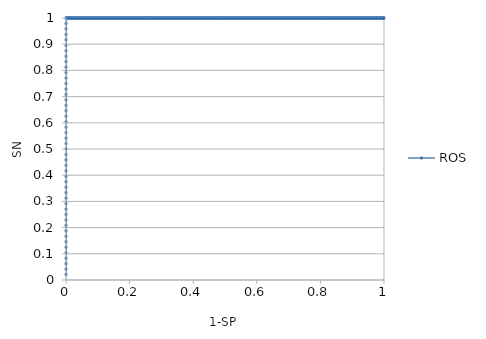
| Category | ROS |
|---|---|
| 0.0 | 0.021 |
| 0.0 | 0.042 |
| 0.0 | 0.062 |
| 0.0 | 0.083 |
| 0.0 | 0.104 |
| 0.0 | 0.125 |
| 0.0 | 0.146 |
| 0.0 | 0.167 |
| 0.0 | 0.188 |
| 0.0 | 0.208 |
| 0.0 | 0.229 |
| 0.0 | 0.25 |
| 0.0 | 0.271 |
| 0.0 | 0.292 |
| 0.0 | 0.312 |
| 0.0 | 0.333 |
| 0.0 | 0.354 |
| 0.0 | 0.375 |
| 0.0 | 0.396 |
| 0.0 | 0.417 |
| 0.0 | 0.438 |
| 0.0 | 0.458 |
| 0.0 | 0.479 |
| 0.0 | 0.5 |
| 0.0 | 0.521 |
| 0.0 | 0.542 |
| 0.0 | 0.562 |
| 0.0 | 0.583 |
| 0.0 | 0.604 |
| 0.0 | 0.625 |
| 0.0 | 0.646 |
| 0.0 | 0.667 |
| 0.0 | 0.688 |
| 0.0 | 0.708 |
| 0.0 | 0.729 |
| 0.0 | 0.75 |
| 0.0 | 0.771 |
| 0.0 | 0.792 |
| 0.0 | 0.812 |
| 0.0 | 0.833 |
| 0.0 | 0.854 |
| 0.0 | 0.875 |
| 0.0 | 0.896 |
| 0.0 | 0.917 |
| 0.0 | 0.938 |
| 0.0 | 0.958 |
| 0.0 | 0.979 |
| 0.0 | 1 |
| 0.00067476383265852 | 1 |
| 0.00134952766531715 | 1 |
| 0.00202429149797567 | 1 |
| 0.0026990553306343 | 1 |
| 0.00337381916329282 | 1 |
| 0.00404858299595146 | 1 |
| 0.00472334682860998 | 1 |
| 0.00539811066126861 | 1 |
| 0.00607287449392713 | 1 |
| 0.00674763832658565 | 1 |
| 0.00742240215924428 | 1 |
| 0.0080971659919028 | 1 |
| 0.00877192982456143 | 1 |
| 0.00944669365721995 | 1 |
| 0.0101214574898786 | 1 |
| 0.0107962213225371 | 1 |
| 0.0114709851551957 | 1 |
| 0.0121457489878543 | 1 |
| 0.0128205128205128 | 1 |
| 0.0134952766531714 | 1 |
| 0.0141700404858299 | 1 |
| 0.0148448043184886 | 1 |
| 0.0155195681511471 | 1 |
| 0.0161943319838057 | 1 |
| 0.0168690958164642 | 1 |
| 0.0175438596491229 | 1 |
| 0.0182186234817814 | 1 |
| 0.0188933873144399 | 1 |
| 0.0195681511470985 | 1 |
| 0.0202429149797571 | 1 |
| 0.0209176788124157 | 1 |
| 0.0215924426450742 | 1 |
| 0.0222672064777328 | 1 |
| 0.0229419703103914 | 1 |
| 0.0236167341430499 | 1 |
| 0.0242914979757085 | 1 |
| 0.024966261808367 | 1 |
| 0.0256410256410257 | 1 |
| 0.0263157894736842 | 1 |
| 0.0269905533063428 | 1 |
| 0.0276653171390013 | 1 |
| 0.02834008097166 | 1 |
| 0.0290148448043185 | 1 |
| 0.029689608636977 | 1 |
| 0.0303643724696356 | 1 |
| 0.0310391363022942 | 1 |
| 0.0317139001349528 | 1 |
| 0.0323886639676113 | 1 |
| 0.0330634278002699 | 1 |
| 0.0337381916329285 | 1 |
| 0.0344129554655871 | 1 |
| 0.0350877192982456 | 1 |
| 0.0357624831309041 | 1 |
| 0.0364372469635628 | 1 |
| 0.0371120107962213 | 1 |
| 0.0377867746288799 | 1 |
| 0.0384615384615384 | 1 |
| 0.0391363022941971 | 1 |
| 0.0398110661268556 | 1 |
| 0.0404858299595142 | 1 |
| 0.0411605937921727 | 1 |
| 0.0418353576248313 | 1 |
| 0.0425101214574899 | 1 |
| 0.0431848852901484 | 1 |
| 0.043859649122807 | 1 |
| 0.0445344129554656 | 1 |
| 0.0452091767881242 | 1 |
| 0.0458839406207827 | 1 |
| 0.0465587044534413 | 1 |
| 0.0472334682860999 | 1 |
| 0.0479082321187584 | 1 |
| 0.048582995951417 | 1 |
| 0.0492577597840755 | 1 |
| 0.0499325236167342 | 1 |
| 0.0506072874493927 | 1 |
| 0.0512820512820513 | 1 |
| 0.0519568151147098 | 1 |
| 0.0526315789473685 | 1 |
| 0.053306342780027 | 1 |
| 0.0539811066126855 | 1 |
| 0.0546558704453441 | 1 |
| 0.0553306342780027 | 1 |
| 0.0560053981106613 | 1 |
| 0.0566801619433198 | 1 |
| 0.0573549257759785 | 1 |
| 0.058029689608637 | 1 |
| 0.0587044534412956 | 1 |
| 0.0593792172739541 | 1 |
| 0.0600539811066126 | 1 |
| 0.0607287449392713 | 1 |
| 0.0614035087719298 | 1 |
| 0.0620782726045884 | 1 |
| 0.0627530364372469 | 1 |
| 0.0634278002699056 | 1 |
| 0.0641025641025641 | 1 |
| 0.0647773279352226 | 1 |
| 0.0654520917678812 | 1 |
| 0.0661268556005398 | 1 |
| 0.0668016194331984 | 1 |
| 0.0674763832658569 | 1 |
| 0.0681511470985156 | 1 |
| 0.0688259109311741 | 1 |
| 0.0695006747638327 | 1 |
| 0.0701754385964912 | 1 |
| 0.0708502024291497 | 1 |
| 0.0715249662618084 | 1 |
| 0.0721997300944669 | 1 |
| 0.0728744939271255 | 1 |
| 0.0735492577597841 | 1 |
| 0.0742240215924427 | 1 |
| 0.0748987854251012 | 1 |
| 0.0755735492577598 | 1 |
| 0.0762483130904184 | 1 |
| 0.0769230769230769 | 1 |
| 0.0775978407557355 | 1 |
| 0.078272604588394 | 1 |
| 0.0789473684210527 | 1 |
| 0.0796221322537112 | 1 |
| 0.0802968960863698 | 1 |
| 0.0809716599190283 | 1 |
| 0.081646423751687 | 1 |
| 0.0823211875843455 | 1 |
| 0.082995951417004 | 1 |
| 0.0836707152496626 | 1 |
| 0.0843454790823212 | 1 |
| 0.0850202429149798 | 1 |
| 0.0856950067476383 | 1 |
| 0.0863697705802969 | 1 |
| 0.0870445344129555 | 1 |
| 0.0877192982456141 | 1 |
| 0.0883940620782726 | 1 |
| 0.0890688259109311 | 1 |
| 0.0897435897435898 | 1 |
| 0.0904183535762483 | 1 |
| 0.0910931174089069 | 1 |
| 0.0917678812415654 | 1 |
| 0.0924426450742241 | 1 |
| 0.0931174089068826 | 1 |
| 0.0937921727395412 | 1 |
| 0.0944669365721997 | 1 |
| 0.0951417004048582 | 1 |
| 0.0958164642375169 | 1 |
| 0.0964912280701754 | 1 |
| 0.097165991902834 | 1 |
| 0.0978407557354926 | 1 |
| 0.0985155195681512 | 1 |
| 0.0991902834008097 | 1 |
| 0.0998650472334683 | 1 |
| 0.100539811066127 | 1 |
| 0.101214574898785 | 1 |
| 0.101889338731444 | 1 |
| 0.102564102564103 | 1 |
| 0.103238866396761 | 1 |
| 0.10391363022942 | 1 |
| 0.104588394062078 | 1 |
| 0.105263157894737 | 1 |
| 0.105937921727395 | 1 |
| 0.106612685560054 | 1 |
| 0.107287449392713 | 1 |
| 0.107962213225371 | 1 |
| 0.10863697705803 | 1 |
| 0.109311740890688 | 1 |
| 0.109986504723347 | 1 |
| 0.110661268556005 | 1 |
| 0.111336032388664 | 1 |
| 0.112010796221322 | 1 |
| 0.112685560053981 | 1 |
| 0.11336032388664 | 1 |
| 0.114035087719298 | 1 |
| 0.114709851551957 | 1 |
| 0.115384615384615 | 1 |
| 0.116059379217274 | 1 |
| 0.116734143049933 | 1 |
| 0.117408906882591 | 1 |
| 0.11808367071525 | 1 |
| 0.118758434547908 | 1 |
| 0.119433198380567 | 1 |
| 0.120107962213225 | 1 |
| 0.120782726045884 | 1 |
| 0.121457489878543 | 1 |
| 0.122132253711201 | 1 |
| 0.12280701754386 | 1 |
| 0.123481781376518 | 1 |
| 0.124156545209177 | 1 |
| 0.124831309041835 | 1 |
| 0.125506072874494 | 1 |
| 0.126180836707153 | 1 |
| 0.126855600539811 | 1 |
| 0.12753036437247 | 1 |
| 0.128205128205128 | 1 |
| 0.128879892037787 | 1 |
| 0.129554655870445 | 1 |
| 0.130229419703104 | 1 |
| 0.130904183535763 | 1 |
| 0.131578947368421 | 1 |
| 0.13225371120108 | 1 |
| 0.132928475033738 | 1 |
| 0.133603238866397 | 1 |
| 0.134278002699055 | 1 |
| 0.134952766531714 | 1 |
| 0.135627530364372 | 1 |
| 0.136302294197031 | 1 |
| 0.13697705802969 | 1 |
| 0.137651821862348 | 1 |
| 0.138326585695007 | 1 |
| 0.139001349527665 | 1 |
| 0.139676113360324 | 1 |
| 0.140350877192982 | 1 |
| 0.141025641025641 | 1 |
| 0.1417004048583 | 1 |
| 0.142375168690958 | 1 |
| 0.143049932523617 | 1 |
| 0.143724696356275 | 1 |
| 0.144399460188934 | 1 |
| 0.145074224021592 | 1 |
| 0.145748987854251 | 1 |
| 0.14642375168691 | 1 |
| 0.147098515519568 | 1 |
| 0.147773279352227 | 1 |
| 0.148448043184885 | 1 |
| 0.149122807017544 | 1 |
| 0.149797570850202 | 1 |
| 0.150472334682861 | 1 |
| 0.15114709851552 | 1 |
| 0.151821862348178 | 1 |
| 0.152496626180837 | 1 |
| 0.153171390013495 | 1 |
| 0.153846153846154 | 1 |
| 0.154520917678812 | 1 |
| 0.155195681511471 | 1 |
| 0.15587044534413 | 1 |
| 0.156545209176788 | 1 |
| 0.157219973009447 | 1 |
| 0.157894736842105 | 1 |
| 0.158569500674764 | 1 |
| 0.159244264507422 | 1 |
| 0.159919028340081 | 1 |
| 0.16059379217274 | 1 |
| 0.161268556005398 | 1 |
| 0.161943319838057 | 1 |
| 0.162618083670715 | 1 |
| 0.163292847503374 | 1 |
| 0.163967611336032 | 1 |
| 0.164642375168691 | 1 |
| 0.165317139001349 | 1 |
| 0.165991902834008 | 1 |
| 0.166666666666667 | 1 |
| 0.167341430499325 | 1 |
| 0.168016194331984 | 1 |
| 0.168690958164642 | 1 |
| 0.169365721997301 | 1 |
| 0.17004048582996 | 1 |
| 0.170715249662618 | 1 |
| 0.171390013495277 | 1 |
| 0.172064777327935 | 1 |
| 0.172739541160594 | 1 |
| 0.173414304993252 | 1 |
| 0.174089068825911 | 1 |
| 0.17476383265857 | 1 |
| 0.175438596491228 | 1 |
| 0.176113360323887 | 1 |
| 0.176788124156545 | 1 |
| 0.177462887989204 | 1 |
| 0.178137651821862 | 1 |
| 0.178812415654521 | 1 |
| 0.17948717948718 | 1 |
| 0.180161943319838 | 1 |
| 0.180836707152497 | 1 |
| 0.181511470985155 | 1 |
| 0.182186234817814 | 1 |
| 0.182860998650472 | 1 |
| 0.183535762483131 | 1 |
| 0.18421052631579 | 1 |
| 0.184885290148448 | 1 |
| 0.185560053981107 | 1 |
| 0.186234817813765 | 1 |
| 0.186909581646424 | 1 |
| 0.187584345479082 | 1 |
| 0.188259109311741 | 1 |
| 0.188933873144399 | 1 |
| 0.189608636977058 | 1 |
| 0.190283400809717 | 1 |
| 0.190958164642375 | 1 |
| 0.191632928475034 | 1 |
| 0.192307692307692 | 1 |
| 0.192982456140351 | 1 |
| 0.193657219973009 | 1 |
| 0.194331983805668 | 1 |
| 0.195006747638327 | 1 |
| 0.195681511470985 | 1 |
| 0.196356275303644 | 1 |
| 0.197031039136302 | 1 |
| 0.197705802968961 | 1 |
| 0.198380566801619 | 1 |
| 0.199055330634278 | 1 |
| 0.199730094466937 | 1 |
| 0.200404858299595 | 1 |
| 0.201079622132254 | 1 |
| 0.201754385964912 | 1 |
| 0.202429149797571 | 1 |
| 0.203103913630229 | 1 |
| 0.203778677462888 | 1 |
| 0.204453441295547 | 1 |
| 0.205128205128205 | 1 |
| 0.205802968960864 | 1 |
| 0.206477732793522 | 1 |
| 0.207152496626181 | 1 |
| 0.207827260458839 | 1 |
| 0.208502024291498 | 1 |
| 0.209176788124156 | 1 |
| 0.209851551956815 | 1 |
| 0.210526315789474 | 1 |
| 0.211201079622132 | 1 |
| 0.211875843454791 | 1 |
| 0.212550607287449 | 1 |
| 0.213225371120108 | 1 |
| 0.213900134952766 | 1 |
| 0.214574898785425 | 1 |
| 0.215249662618084 | 1 |
| 0.215924426450742 | 1 |
| 0.216599190283401 | 1 |
| 0.217273954116059 | 1 |
| 0.217948717948718 | 1 |
| 0.218623481781376 | 1 |
| 0.219298245614035 | 1 |
| 0.219973009446694 | 1 |
| 0.220647773279352 | 1 |
| 0.221322537112011 | 1 |
| 0.221997300944669 | 1 |
| 0.222672064777328 | 1 |
| 0.223346828609987 | 1 |
| 0.224021592442645 | 1 |
| 0.224696356275304 | 1 |
| 0.225371120107962 | 1 |
| 0.226045883940621 | 1 |
| 0.226720647773279 | 1 |
| 0.227395411605938 | 1 |
| 0.228070175438597 | 1 |
| 0.228744939271255 | 1 |
| 0.229419703103914 | 1 |
| 0.230094466936572 | 1 |
| 0.230769230769231 | 1 |
| 0.231443994601889 | 1 |
| 0.232118758434548 | 1 |
| 0.232793522267206 | 1 |
| 0.233468286099865 | 1 |
| 0.234143049932524 | 1 |
| 0.234817813765182 | 1 |
| 0.235492577597841 | 1 |
| 0.236167341430499 | 1 |
| 0.236842105263158 | 1 |
| 0.237516869095816 | 1 |
| 0.238191632928475 | 1 |
| 0.238866396761134 | 1 |
| 0.239541160593792 | 1 |
| 0.240215924426451 | 1 |
| 0.240890688259109 | 1 |
| 0.241565452091768 | 1 |
| 0.242240215924426 | 1 |
| 0.242914979757085 | 1 |
| 0.243589743589744 | 1 |
| 0.244264507422402 | 1 |
| 0.244939271255061 | 1 |
| 0.245614035087719 | 1 |
| 0.246288798920378 | 1 |
| 0.246963562753036 | 1 |
| 0.247638326585695 | 1 |
| 0.248313090418354 | 1 |
| 0.248987854251012 | 1 |
| 0.249662618083671 | 1 |
| 0.250337381916329 | 1 |
| 0.251012145748988 | 1 |
| 0.251686909581646 | 1 |
| 0.252361673414305 | 1 |
| 0.253036437246964 | 1 |
| 0.253711201079622 | 1 |
| 0.254385964912281 | 1 |
| 0.255060728744939 | 1 |
| 0.255735492577598 | 1 |
| 0.256410256410256 | 1 |
| 0.257085020242915 | 1 |
| 0.257759784075574 | 1 |
| 0.258434547908232 | 1 |
| 0.259109311740891 | 1 |
| 0.259784075573549 | 1 |
| 0.260458839406208 | 1 |
| 0.261133603238866 | 1 |
| 0.261808367071525 | 1 |
| 0.262483130904184 | 1 |
| 0.263157894736842 | 1 |
| 0.263832658569501 | 1 |
| 0.264507422402159 | 1 |
| 0.265182186234818 | 1 |
| 0.265856950067476 | 1 |
| 0.266531713900135 | 1 |
| 0.267206477732793 | 1 |
| 0.267881241565452 | 1 |
| 0.268556005398111 | 1 |
| 0.269230769230769 | 1 |
| 0.269905533063428 | 1 |
| 0.270580296896086 | 1 |
| 0.271255060728745 | 1 |
| 0.271929824561403 | 1 |
| 0.272604588394062 | 1 |
| 0.273279352226721 | 1 |
| 0.273954116059379 | 1 |
| 0.274628879892038 | 1 |
| 0.275303643724696 | 1 |
| 0.275978407557355 | 1 |
| 0.276653171390013 | 1 |
| 0.277327935222672 | 1 |
| 0.278002699055331 | 1 |
| 0.278677462887989 | 1 |
| 0.279352226720648 | 1 |
| 0.280026990553306 | 1 |
| 0.280701754385965 | 1 |
| 0.281376518218623 | 1 |
| 0.282051282051282 | 1 |
| 0.282726045883941 | 1 |
| 0.283400809716599 | 1 |
| 0.284075573549258 | 1 |
| 0.284750337381916 | 1 |
| 0.285425101214575 | 1 |
| 0.286099865047233 | 1 |
| 0.286774628879892 | 1 |
| 0.287449392712551 | 1 |
| 0.288124156545209 | 1 |
| 0.288798920377868 | 1 |
| 0.289473684210526 | 1 |
| 0.290148448043185 | 1 |
| 0.290823211875843 | 1 |
| 0.291497975708502 | 1 |
| 0.292172739541161 | 1 |
| 0.292847503373819 | 1 |
| 0.293522267206478 | 1 |
| 0.294197031039136 | 1 |
| 0.294871794871795 | 1 |
| 0.295546558704453 | 1 |
| 0.296221322537112 | 1 |
| 0.296896086369771 | 1 |
| 0.297570850202429 | 1 |
| 0.298245614035088 | 1 |
| 0.298920377867746 | 1 |
| 0.299595141700405 | 1 |
| 0.300269905533063 | 1 |
| 0.300944669365722 | 1 |
| 0.301619433198381 | 1 |
| 0.302294197031039 | 1 |
| 0.302968960863698 | 1 |
| 0.303643724696356 | 1 |
| 0.304318488529015 | 1 |
| 0.304993252361673 | 1 |
| 0.305668016194332 | 1 |
| 0.306342780026991 | 1 |
| 0.307017543859649 | 1 |
| 0.307692307692308 | 1 |
| 0.308367071524966 | 1 |
| 0.309041835357625 | 1 |
| 0.309716599190283 | 1 |
| 0.310391363022942 | 1 |
| 0.311066126855601 | 1 |
| 0.311740890688259 | 1 |
| 0.312415654520918 | 1 |
| 0.313090418353576 | 1 |
| 0.313765182186235 | 1 |
| 0.314439946018893 | 1 |
| 0.315114709851552 | 1 |
| 0.31578947368421 | 1 |
| 0.316464237516869 | 1 |
| 0.317139001349528 | 1 |
| 0.317813765182186 | 1 |
| 0.318488529014845 | 1 |
| 0.319163292847503 | 1 |
| 0.319838056680162 | 1 |
| 0.32051282051282 | 1 |
| 0.321187584345479 | 1 |
| 0.321862348178138 | 1 |
| 0.322537112010796 | 1 |
| 0.323211875843455 | 1 |
| 0.323886639676113 | 1 |
| 0.324561403508772 | 1 |
| 0.32523616734143 | 1 |
| 0.325910931174089 | 1 |
| 0.326585695006748 | 1 |
| 0.327260458839406 | 1 |
| 0.327935222672065 | 1 |
| 0.328609986504723 | 1 |
| 0.329284750337382 | 1 |
| 0.32995951417004 | 1 |
| 0.330634278002699 | 1 |
| 0.331309041835358 | 1 |
| 0.331983805668016 | 1 |
| 0.332658569500675 | 1 |
| 0.333333333333333 | 1 |
| 0.334008097165992 | 1 |
| 0.334682860998651 | 1 |
| 0.335357624831309 | 1 |
| 0.336032388663968 | 1 |
| 0.336707152496626 | 1 |
| 0.337381916329285 | 1 |
| 0.338056680161943 | 1 |
| 0.338731443994602 | 1 |
| 0.33940620782726 | 1 |
| 0.340080971659919 | 1 |
| 0.340755735492578 | 1 |
| 0.341430499325236 | 1 |
| 0.342105263157895 | 1 |
| 0.342780026990553 | 1 |
| 0.343454790823212 | 1 |
| 0.34412955465587 | 1 |
| 0.344804318488529 | 1 |
| 0.345479082321188 | 1 |
| 0.346153846153846 | 1 |
| 0.346828609986505 | 1 |
| 0.347503373819163 | 1 |
| 0.348178137651822 | 1 |
| 0.34885290148448 | 1 |
| 0.349527665317139 | 1 |
| 0.350202429149798 | 1 |
| 0.350877192982456 | 1 |
| 0.351551956815115 | 1 |
| 0.352226720647773 | 1 |
| 0.352901484480432 | 1 |
| 0.35357624831309 | 1 |
| 0.354251012145749 | 1 |
| 0.354925775978408 | 1 |
| 0.355600539811066 | 1 |
| 0.356275303643725 | 1 |
| 0.356950067476383 | 1 |
| 0.357624831309042 | 1 |
| 0.3582995951417 | 1 |
| 0.358974358974359 | 1 |
| 0.359649122807018 | 1 |
| 0.360323886639676 | 1 |
| 0.360998650472335 | 1 |
| 0.361673414304993 | 1 |
| 0.362348178137652 | 1 |
| 0.36302294197031 | 1 |
| 0.363697705802969 | 1 |
| 0.364372469635627 | 1 |
| 0.365047233468286 | 1 |
| 0.365721997300945 | 1 |
| 0.366396761133603 | 1 |
| 0.367071524966262 | 1 |
| 0.36774628879892 | 1 |
| 0.368421052631579 | 1 |
| 0.369095816464237 | 1 |
| 0.369770580296896 | 1 |
| 0.370445344129555 | 1 |
| 0.371120107962213 | 1 |
| 0.371794871794872 | 1 |
| 0.37246963562753 | 1 |
| 0.373144399460189 | 1 |
| 0.373819163292847 | 1 |
| 0.374493927125506 | 1 |
| 0.375168690958165 | 1 |
| 0.375843454790823 | 1 |
| 0.376518218623482 | 1 |
| 0.37719298245614 | 1 |
| 0.377867746288799 | 1 |
| 0.378542510121457 | 1 |
| 0.379217273954116 | 1 |
| 0.379892037786775 | 1 |
| 0.380566801619433 | 1 |
| 0.381241565452092 | 1 |
| 0.38191632928475 | 1 |
| 0.382591093117409 | 1 |
| 0.383265856950067 | 1 |
| 0.383940620782726 | 1 |
| 0.384615384615385 | 1 |
| 0.385290148448043 | 1 |
| 0.385964912280702 | 1 |
| 0.38663967611336 | 1 |
| 0.387314439946019 | 1 |
| 0.387989203778677 | 1 |
| 0.388663967611336 | 1 |
| 0.389338731443995 | 1 |
| 0.390013495276653 | 1 |
| 0.390688259109312 | 1 |
| 0.39136302294197 | 1 |
| 0.392037786774629 | 1 |
| 0.392712550607287 | 1 |
| 0.393387314439946 | 1 |
| 0.394062078272605 | 1 |
| 0.394736842105263 | 1 |
| 0.395411605937922 | 1 |
| 0.39608636977058 | 1 |
| 0.396761133603239 | 1 |
| 0.397435897435897 | 1 |
| 0.398110661268556 | 1 |
| 0.398785425101215 | 1 |
| 0.399460188933873 | 1 |
| 0.400134952766532 | 1 |
| 0.40080971659919 | 1 |
| 0.401484480431849 | 1 |
| 0.402159244264507 | 1 |
| 0.402834008097166 | 1 |
| 0.403508771929825 | 1 |
| 0.404183535762483 | 1 |
| 0.404858299595142 | 1 |
| 0.4055330634278 | 1 |
| 0.406207827260459 | 1 |
| 0.406882591093117 | 1 |
| 0.407557354925776 | 1 |
| 0.408232118758435 | 1 |
| 0.408906882591093 | 1 |
| 0.409581646423752 | 1 |
| 0.41025641025641 | 1 |
| 0.410931174089069 | 1 |
| 0.411605937921727 | 1 |
| 0.412280701754386 | 1 |
| 0.412955465587045 | 1 |
| 0.413630229419703 | 1 |
| 0.414304993252362 | 1 |
| 0.41497975708502 | 1 |
| 0.415654520917679 | 1 |
| 0.416329284750337 | 1 |
| 0.417004048582996 | 1 |
| 0.417678812415655 | 1 |
| 0.418353576248313 | 1 |
| 0.419028340080972 | 1 |
| 0.41970310391363 | 1 |
| 0.420377867746289 | 1 |
| 0.421052631578947 | 1 |
| 0.421727395411606 | 1 |
| 0.422402159244265 | 1 |
| 0.423076923076923 | 1 |
| 0.423751686909582 | 1 |
| 0.42442645074224 | 1 |
| 0.425101214574899 | 1 |
| 0.425775978407557 | 1 |
| 0.426450742240216 | 1 |
| 0.427125506072875 | 1 |
| 0.427800269905533 | 1 |
| 0.428475033738192 | 1 |
| 0.42914979757085 | 1 |
| 0.429824561403509 | 1 |
| 0.430499325236167 | 1 |
| 0.431174089068826 | 1 |
| 0.431848852901484 | 1 |
| 0.432523616734143 | 1 |
| 0.433198380566802 | 1 |
| 0.43387314439946 | 1 |
| 0.434547908232119 | 1 |
| 0.435222672064777 | 1 |
| 0.435897435897436 | 1 |
| 0.436572199730094 | 1 |
| 0.437246963562753 | 1 |
| 0.437921727395412 | 1 |
| 0.43859649122807 | 1 |
| 0.439271255060729 | 1 |
| 0.439946018893387 | 1 |
| 0.440620782726046 | 1 |
| 0.441295546558704 | 1 |
| 0.441970310391363 | 1 |
| 0.442645074224022 | 1 |
| 0.44331983805668 | 1 |
| 0.443994601889339 | 1 |
| 0.444669365721997 | 1 |
| 0.445344129554656 | 1 |
| 0.446018893387314 | 1 |
| 0.446693657219973 | 1 |
| 0.447368421052632 | 1 |
| 0.44804318488529 | 1 |
| 0.448717948717949 | 1 |
| 0.449392712550607 | 1 |
| 0.450067476383266 | 1 |
| 0.450742240215924 | 1 |
| 0.451417004048583 | 1 |
| 0.452091767881242 | 1 |
| 0.4527665317139 | 1 |
| 0.453441295546559 | 1 |
| 0.454116059379217 | 1 |
| 0.454790823211876 | 1 |
| 0.455465587044534 | 1 |
| 0.456140350877193 | 1 |
| 0.456815114709852 | 1 |
| 0.45748987854251 | 1 |
| 0.458164642375169 | 1 |
| 0.458839406207827 | 1 |
| 0.459514170040486 | 1 |
| 0.460188933873144 | 1 |
| 0.460863697705803 | 1 |
| 0.461538461538462 | 1 |
| 0.46221322537112 | 1 |
| 0.462887989203779 | 1 |
| 0.463562753036437 | 1 |
| 0.464237516869096 | 1 |
| 0.464912280701754 | 1 |
| 0.465587044534413 | 1 |
| 0.466261808367072 | 1 |
| 0.46693657219973 | 1 |
| 0.467611336032389 | 1 |
| 0.468286099865047 | 1 |
| 0.468960863697706 | 1 |
| 0.469635627530364 | 1 |
| 0.470310391363023 | 1 |
| 0.470985155195682 | 1 |
| 0.47165991902834 | 1 |
| 0.472334682860999 | 1 |
| 0.473009446693657 | 1 |
| 0.473684210526316 | 1 |
| 0.474358974358974 | 1 |
| 0.475033738191633 | 1 |
| 0.475708502024292 | 1 |
| 0.47638326585695 | 1 |
| 0.477058029689609 | 1 |
| 0.477732793522267 | 1 |
| 0.478407557354926 | 1 |
| 0.479082321187584 | 1 |
| 0.479757085020243 | 1 |
| 0.480431848852901 | 1 |
| 0.48110661268556 | 1 |
| 0.481781376518219 | 1 |
| 0.482456140350877 | 1 |
| 0.483130904183536 | 1 |
| 0.483805668016194 | 1 |
| 0.484480431848853 | 1 |
| 0.485155195681511 | 1 |
| 0.48582995951417 | 1 |
| 0.486504723346829 | 1 |
| 0.487179487179487 | 1 |
| 0.487854251012146 | 1 |
| 0.488529014844804 | 1 |
| 0.489203778677463 | 1 |
| 0.489878542510121 | 1 |
| 0.49055330634278 | 1 |
| 0.491228070175439 | 1 |
| 0.491902834008097 | 1 |
| 0.492577597840756 | 1 |
| 0.493252361673414 | 1 |
| 0.493927125506073 | 1 |
| 0.494601889338731 | 1 |
| 0.49527665317139 | 1 |
| 0.495951417004049 | 1 |
| 0.496626180836707 | 1 |
| 0.497300944669366 | 1 |
| 0.497975708502024 | 1 |
| 0.498650472334683 | 1 |
| 0.499325236167342 | 1 |
| 0.5 | 1 |
| 0.500674763832659 | 1 |
| 0.501349527665317 | 1 |
| 0.502024291497976 | 1 |
| 0.502699055330634 | 1 |
| 0.503373819163293 | 1 |
| 0.504048582995951 | 1 |
| 0.50472334682861 | 1 |
| 0.505398110661269 | 1 |
| 0.506072874493927 | 1 |
| 0.506747638326586 | 1 |
| 0.507422402159244 | 1 |
| 0.508097165991903 | 1 |
| 0.508771929824561 | 1 |
| 0.50944669365722 | 1 |
| 0.510121457489878 | 1 |
| 0.510796221322537 | 1 |
| 0.511470985155196 | 1 |
| 0.512145748987854 | 1 |
| 0.512820512820513 | 1 |
| 0.513495276653171 | 1 |
| 0.51417004048583 | 1 |
| 0.514844804318489 | 1 |
| 0.515519568151147 | 1 |
| 0.516194331983806 | 1 |
| 0.516869095816464 | 1 |
| 0.517543859649123 | 1 |
| 0.518218623481781 | 1 |
| 0.51889338731444 | 1 |
| 0.519568151147099 | 1 |
| 0.520242914979757 | 1 |
| 0.520917678812416 | 1 |
| 0.521592442645074 | 1 |
| 0.522267206477733 | 1 |
| 0.522941970310391 | 1 |
| 0.52361673414305 | 1 |
| 0.524291497975709 | 1 |
| 0.524966261808367 | 1 |
| 0.525641025641026 | 1 |
| 0.526315789473684 | 1 |
| 0.526990553306343 | 1 |
| 0.527665317139001 | 1 |
| 0.52834008097166 | 1 |
| 0.529014844804318 | 1 |
| 0.529689608636977 | 1 |
| 0.530364372469636 | 1 |
| 0.531039136302294 | 1 |
| 0.531713900134953 | 1 |
| 0.532388663967611 | 1 |
| 0.53306342780027 | 1 |
| 0.533738191632928 | 1 |
| 0.534412955465587 | 1 |
| 0.535087719298246 | 1 |
| 0.535762483130904 | 1 |
| 0.536437246963563 | 1 |
| 0.537112010796221 | 1 |
| 0.53778677462888 | 1 |
| 0.538461538461538 | 1 |
| 0.539136302294197 | 1 |
| 0.539811066126856 | 1 |
| 0.540485829959514 | 1 |
| 0.541160593792173 | 1 |
| 0.541835357624831 | 1 |
| 0.54251012145749 | 1 |
| 0.543184885290148 | 1 |
| 0.543859649122807 | 1 |
| 0.544534412955466 | 1 |
| 0.545209176788124 | 1 |
| 0.545883940620783 | 1 |
| 0.546558704453441 | 1 |
| 0.5472334682861 | 1 |
| 0.547908232118759 | 1 |
| 0.548582995951417 | 1 |
| 0.549257759784076 | 1 |
| 0.549932523616734 | 1 |
| 0.550607287449393 | 1 |
| 0.551282051282051 | 1 |
| 0.55195681511471 | 1 |
| 0.552631578947368 | 1 |
| 0.553306342780027 | 1 |
| 0.553981106612686 | 1 |
| 0.554655870445344 | 1 |
| 0.555330634278003 | 1 |
| 0.556005398110661 | 1 |
| 0.55668016194332 | 1 |
| 0.557354925775978 | 1 |
| 0.558029689608637 | 1 |
| 0.558704453441295 | 1 |
| 0.559379217273954 | 1 |
| 0.560053981106613 | 1 |
| 0.560728744939271 | 1 |
| 0.56140350877193 | 1 |
| 0.562078272604588 | 1 |
| 0.562753036437247 | 1 |
| 0.563427800269906 | 1 |
| 0.564102564102564 | 1 |
| 0.564777327935223 | 1 |
| 0.565452091767881 | 1 |
| 0.56612685560054 | 1 |
| 0.566801619433198 | 1 |
| 0.567476383265857 | 1 |
| 0.568151147098515 | 1 |
| 0.568825910931174 | 1 |
| 0.569500674763833 | 1 |
| 0.570175438596491 | 1 |
| 0.57085020242915 | 1 |
| 0.571524966261808 | 1 |
| 0.572199730094467 | 1 |
| 0.572874493927126 | 1 |
| 0.573549257759784 | 1 |
| 0.574224021592443 | 1 |
| 0.574898785425101 | 1 |
| 0.57557354925776 | 1 |
| 0.576248313090418 | 1 |
| 0.576923076923077 | 1 |
| 0.577597840755735 | 1 |
| 0.578272604588394 | 1 |
| 0.578947368421053 | 1 |
| 0.579622132253711 | 1 |
| 0.58029689608637 | 1 |
| 0.580971659919028 | 1 |
| 0.581646423751687 | 1 |
| 0.582321187584345 | 1 |
| 0.582995951417004 | 1 |
| 0.583670715249663 | 1 |
| 0.584345479082321 | 1 |
| 0.58502024291498 | 1 |
| 0.585695006747638 | 1 |
| 0.586369770580297 | 1 |
| 0.587044534412955 | 1 |
| 0.587719298245614 | 1 |
| 0.588394062078273 | 1 |
| 0.589068825910931 | 1 |
| 0.58974358974359 | 1 |
| 0.590418353576248 | 1 |
| 0.591093117408907 | 1 |
| 0.591767881241565 | 1 |
| 0.592442645074224 | 1 |
| 0.593117408906883 | 1 |
| 0.593792172739541 | 1 |
| 0.5944669365722 | 1 |
| 0.595141700404858 | 1 |
| 0.595816464237517 | 1 |
| 0.596491228070176 | 1 |
| 0.597165991902834 | 1 |
| 0.597840755735493 | 1 |
| 0.598515519568151 | 1 |
| 0.59919028340081 | 1 |
| 0.599865047233468 | 1 |
| 0.600539811066127 | 1 |
| 0.601214574898785 | 1 |
| 0.601889338731444 | 1 |
| 0.602564102564103 | 1 |
| 0.603238866396761 | 1 |
| 0.60391363022942 | 1 |
| 0.604588394062078 | 1 |
| 0.605263157894737 | 1 |
| 0.605937921727395 | 1 |
| 0.606612685560054 | 1 |
| 0.607287449392712 | 1 |
| 0.607962213225371 | 1 |
| 0.60863697705803 | 1 |
| 0.609311740890688 | 1 |
| 0.609986504723347 | 1 |
| 0.610661268556005 | 1 |
| 0.611336032388664 | 1 |
| 0.612010796221323 | 1 |
| 0.612685560053981 | 1 |
| 0.61336032388664 | 1 |
| 0.614035087719298 | 1 |
| 0.614709851551957 | 1 |
| 0.615384615384615 | 1 |
| 0.616059379217274 | 1 |
| 0.616734143049932 | 1 |
| 0.617408906882591 | 1 |
| 0.61808367071525 | 1 |
| 0.618758434547908 | 1 |
| 0.619433198380567 | 1 |
| 0.620107962213225 | 1 |
| 0.620782726045884 | 1 |
| 0.621457489878543 | 1 |
| 0.622132253711201 | 1 |
| 0.62280701754386 | 1 |
| 0.623481781376518 | 1 |
| 0.624156545209177 | 1 |
| 0.624831309041835 | 1 |
| 0.625506072874494 | 1 |
| 0.626180836707152 | 1 |
| 0.626855600539811 | 1 |
| 0.62753036437247 | 1 |
| 0.628205128205128 | 1 |
| 0.628879892037787 | 1 |
| 0.629554655870445 | 1 |
| 0.630229419703104 | 1 |
| 0.630904183535762 | 1 |
| 0.631578947368421 | 1 |
| 0.63225371120108 | 1 |
| 0.632928475033738 | 1 |
| 0.633603238866397 | 1 |
| 0.634278002699055 | 1 |
| 0.634952766531714 | 1 |
| 0.635627530364372 | 1 |
| 0.636302294197031 | 1 |
| 0.63697705802969 | 1 |
| 0.637651821862348 | 1 |
| 0.638326585695007 | 1 |
| 0.639001349527665 | 1 |
| 0.639676113360324 | 1 |
| 0.640350877192982 | 1 |
| 0.641025641025641 | 1 |
| 0.6417004048583 | 1 |
| 0.642375168690958 | 1 |
| 0.643049932523617 | 1 |
| 0.643724696356275 | 1 |
| 0.644399460188934 | 1 |
| 0.645074224021592 | 1 |
| 0.645748987854251 | 1 |
| 0.64642375168691 | 1 |
| 0.647098515519568 | 1 |
| 0.647773279352227 | 1 |
| 0.648448043184885 | 1 |
| 0.649122807017544 | 1 |
| 0.649797570850202 | 1 |
| 0.650472334682861 | 1 |
| 0.65114709851552 | 1 |
| 0.651821862348178 | 1 |
| 0.652496626180837 | 1 |
| 0.653171390013495 | 1 |
| 0.653846153846154 | 1 |
| 0.654520917678812 | 1 |
| 0.655195681511471 | 1 |
| 0.65587044534413 | 1 |
| 0.656545209176788 | 1 |
| 0.657219973009447 | 1 |
| 0.657894736842105 | 1 |
| 0.658569500674764 | 1 |
| 0.659244264507422 | 1 |
| 0.659919028340081 | 1 |
| 0.66059379217274 | 1 |
| 0.661268556005398 | 1 |
| 0.661943319838057 | 1 |
| 0.662618083670715 | 1 |
| 0.663292847503374 | 1 |
| 0.663967611336032 | 1 |
| 0.664642375168691 | 1 |
| 0.66531713900135 | 1 |
| 0.665991902834008 | 1 |
| 0.666666666666667 | 1 |
| 0.667341430499325 | 1 |
| 0.668016194331984 | 1 |
| 0.668690958164642 | 1 |
| 0.669365721997301 | 1 |
| 0.67004048582996 | 1 |
| 0.670715249662618 | 1 |
| 0.671390013495277 | 1 |
| 0.672064777327935 | 1 |
| 0.672739541160594 | 1 |
| 0.673414304993252 | 1 |
| 0.674089068825911 | 1 |
| 0.674763832658569 | 1 |
| 0.675438596491228 | 1 |
| 0.676113360323887 | 1 |
| 0.676788124156545 | 1 |
| 0.677462887989204 | 1 |
| 0.678137651821862 | 1 |
| 0.678812415654521 | 1 |
| 0.67948717948718 | 1 |
| 0.680161943319838 | 1 |
| 0.680836707152497 | 1 |
| 0.681511470985155 | 1 |
| 0.682186234817814 | 1 |
| 0.682860998650472 | 1 |
| 0.683535762483131 | 1 |
| 0.68421052631579 | 1 |
| 0.684885290148448 | 1 |
| 0.685560053981107 | 1 |
| 0.686234817813765 | 1 |
| 0.686909581646424 | 1 |
| 0.687584345479082 | 1 |
| 0.688259109311741 | 1 |
| 0.688933873144399 | 1 |
| 0.689608636977058 | 1 |
| 0.690283400809717 | 1 |
| 0.690958164642375 | 1 |
| 0.691632928475034 | 1 |
| 0.692307692307692 | 1 |
| 0.692982456140351 | 1 |
| 0.693657219973009 | 1 |
| 0.694331983805668 | 1 |
| 0.695006747638327 | 1 |
| 0.695681511470985 | 1 |
| 0.696356275303644 | 1 |
| 0.697031039136302 | 1 |
| 0.697705802968961 | 1 |
| 0.698380566801619 | 1 |
| 0.699055330634278 | 1 |
| 0.699730094466937 | 1 |
| 0.700404858299595 | 1 |
| 0.701079622132254 | 1 |
| 0.701754385964912 | 1 |
| 0.702429149797571 | 1 |
| 0.703103913630229 | 1 |
| 0.703778677462888 | 1 |
| 0.704453441295547 | 1 |
| 0.705128205128205 | 1 |
| 0.705802968960864 | 1 |
| 0.706477732793522 | 1 |
| 0.707152496626181 | 1 |
| 0.707827260458839 | 1 |
| 0.708502024291498 | 1 |
| 0.709176788124157 | 1 |
| 0.709851551956815 | 1 |
| 0.710526315789474 | 1 |
| 0.711201079622132 | 1 |
| 0.711875843454791 | 1 |
| 0.712550607287449 | 1 |
| 0.713225371120108 | 1 |
| 0.713900134952767 | 1 |
| 0.714574898785425 | 1 |
| 0.715249662618084 | 1 |
| 0.715924426450742 | 1 |
| 0.716599190283401 | 1 |
| 0.717273954116059 | 1 |
| 0.717948717948718 | 1 |
| 0.718623481781377 | 1 |
| 0.719298245614035 | 1 |
| 0.719973009446694 | 1 |
| 0.720647773279352 | 1 |
| 0.721322537112011 | 1 |
| 0.721997300944669 | 1 |
| 0.722672064777328 | 1 |
| 0.723346828609986 | 1 |
| 0.724021592442645 | 1 |
| 0.724696356275304 | 1 |
| 0.725371120107962 | 1 |
| 0.726045883940621 | 1 |
| 0.726720647773279 | 1 |
| 0.727395411605938 | 1 |
| 0.728070175438597 | 1 |
| 0.728744939271255 | 1 |
| 0.729419703103914 | 1 |
| 0.730094466936572 | 1 |
| 0.730769230769231 | 1 |
| 0.731443994601889 | 1 |
| 0.732118758434548 | 1 |
| 0.732793522267206 | 1 |
| 0.733468286099865 | 1 |
| 0.734143049932524 | 1 |
| 0.734817813765182 | 1 |
| 0.735492577597841 | 1 |
| 0.736167341430499 | 1 |
| 0.736842105263158 | 1 |
| 0.737516869095817 | 1 |
| 0.738191632928475 | 1 |
| 0.738866396761134 | 1 |
| 0.739541160593792 | 1 |
| 0.740215924426451 | 1 |
| 0.740890688259109 | 1 |
| 0.741565452091768 | 1 |
| 0.742240215924426 | 1 |
| 0.742914979757085 | 1 |
| 0.743589743589744 | 1 |
| 0.744264507422402 | 1 |
| 0.744939271255061 | 1 |
| 0.745614035087719 | 1 |
| 0.746288798920378 | 1 |
| 0.746963562753036 | 1 |
| 0.747638326585695 | 1 |
| 0.748313090418354 | 1 |
| 0.748987854251012 | 1 |
| 0.749662618083671 | 1 |
| 0.750337381916329 | 1 |
| 0.751012145748988 | 1 |
| 0.751686909581646 | 1 |
| 0.752361673414305 | 1 |
| 0.753036437246964 | 1 |
| 0.753711201079622 | 1 |
| 0.754385964912281 | 1 |
| 0.755060728744939 | 1 |
| 0.755735492577598 | 1 |
| 0.756410256410256 | 1 |
| 0.757085020242915 | 1 |
| 0.757759784075574 | 1 |
| 0.758434547908232 | 1 |
| 0.759109311740891 | 1 |
| 0.759784075573549 | 1 |
| 0.760458839406208 | 1 |
| 0.761133603238866 | 1 |
| 0.761808367071525 | 1 |
| 0.762483130904184 | 1 |
| 0.763157894736842 | 1 |
| 0.763832658569501 | 1 |
| 0.764507422402159 | 1 |
| 0.765182186234818 | 1 |
| 0.765856950067476 | 1 |
| 0.766531713900135 | 1 |
| 0.767206477732793 | 1 |
| 0.767881241565452 | 1 |
| 0.768556005398111 | 1 |
| 0.769230769230769 | 1 |
| 0.769905533063428 | 1 |
| 0.770580296896086 | 1 |
| 0.771255060728745 | 1 |
| 0.771929824561403 | 1 |
| 0.772604588394062 | 1 |
| 0.773279352226721 | 1 |
| 0.773954116059379 | 1 |
| 0.774628879892038 | 1 |
| 0.775303643724696 | 1 |
| 0.775978407557355 | 1 |
| 0.776653171390014 | 1 |
| 0.777327935222672 | 1 |
| 0.778002699055331 | 1 |
| 0.778677462887989 | 1 |
| 0.779352226720648 | 1 |
| 0.780026990553306 | 1 |
| 0.780701754385965 | 1 |
| 0.781376518218623 | 1 |
| 0.782051282051282 | 1 |
| 0.782726045883941 | 1 |
| 0.783400809716599 | 1 |
| 0.784075573549258 | 1 |
| 0.784750337381916 | 1 |
| 0.785425101214575 | 1 |
| 0.786099865047234 | 1 |
| 0.786774628879892 | 1 |
| 0.787449392712551 | 1 |
| 0.788124156545209 | 1 |
| 0.788798920377868 | 1 |
| 0.789473684210526 | 1 |
| 0.790148448043185 | 1 |
| 0.790823211875843 | 1 |
| 0.791497975708502 | 1 |
| 0.792172739541161 | 1 |
| 0.792847503373819 | 1 |
| 0.793522267206478 | 1 |
| 0.794197031039136 | 1 |
| 0.794871794871795 | 1 |
| 0.795546558704453 | 1 |
| 0.796221322537112 | 1 |
| 0.796896086369771 | 1 |
| 0.797570850202429 | 1 |
| 0.798245614035088 | 1 |
| 0.798920377867746 | 1 |
| 0.799595141700405 | 1 |
| 0.800269905533063 | 1 |
| 0.800944669365722 | 1 |
| 0.80161943319838 | 1 |
| 0.802294197031039 | 1 |
| 0.802968960863698 | 1 |
| 0.803643724696356 | 1 |
| 0.804318488529015 | 1 |
| 0.804993252361673 | 1 |
| 0.805668016194332 | 1 |
| 0.80634278002699 | 1 |
| 0.807017543859649 | 1 |
| 0.807692307692308 | 1 |
| 0.808367071524966 | 1 |
| 0.809041835357625 | 1 |
| 0.809716599190283 | 1 |
| 0.810391363022942 | 1 |
| 0.8110661268556 | 1 |
| 0.811740890688259 | 1 |
| 0.812415654520918 | 1 |
| 0.813090418353576 | 1 |
| 0.813765182186235 | 1 |
| 0.814439946018893 | 1 |
| 0.815114709851552 | 1 |
| 0.81578947368421 | 1 |
| 0.816464237516869 | 1 |
| 0.817139001349528 | 1 |
| 0.817813765182186 | 1 |
| 0.818488529014845 | 1 |
| 0.819163292847503 | 1 |
| 0.819838056680162 | 1 |
| 0.82051282051282 | 1 |
| 0.821187584345479 | 1 |
| 0.821862348178138 | 1 |
| 0.822537112010796 | 1 |
| 0.823211875843455 | 1 |
| 0.823886639676113 | 1 |
| 0.824561403508772 | 1 |
| 0.82523616734143 | 1 |
| 0.825910931174089 | 1 |
| 0.826585695006748 | 1 |
| 0.827260458839406 | 1 |
| 0.827935222672065 | 1 |
| 0.828609986504723 | 1 |
| 0.829284750337382 | 1 |
| 0.82995951417004 | 1 |
| 0.830634278002699 | 1 |
| 0.831309041835358 | 1 |
| 0.831983805668016 | 1 |
| 0.832658569500675 | 1 |
| 0.833333333333333 | 1 |
| 0.834008097165992 | 1 |
| 0.83468286099865 | 1 |
| 0.835357624831309 | 1 |
| 0.836032388663968 | 1 |
| 0.836707152496626 | 1 |
| 0.837381916329285 | 1 |
| 0.838056680161943 | 1 |
| 0.838731443994602 | 1 |
| 0.83940620782726 | 1 |
| 0.840080971659919 | 1 |
| 0.840755735492578 | 1 |
| 0.841430499325236 | 1 |
| 0.842105263157895 | 1 |
| 0.842780026990553 | 1 |
| 0.843454790823212 | 1 |
| 0.84412955465587 | 1 |
| 0.844804318488529 | 1 |
| 0.845479082321188 | 1 |
| 0.846153846153846 | 1 |
| 0.846828609986505 | 1 |
| 0.847503373819163 | 1 |
| 0.848178137651822 | 1 |
| 0.84885290148448 | 1 |
| 0.849527665317139 | 1 |
| 0.850202429149798 | 1 |
| 0.850877192982456 | 1 |
| 0.851551956815115 | 1 |
| 0.852226720647773 | 1 |
| 0.852901484480432 | 1 |
| 0.85357624831309 | 1 |
| 0.854251012145749 | 1 |
| 0.854925775978407 | 1 |
| 0.855600539811066 | 1 |
| 0.856275303643725 | 1 |
| 0.856950067476383 | 1 |
| 0.857624831309042 | 1 |
| 0.8582995951417 | 1 |
| 0.858974358974359 | 1 |
| 0.859649122807017 | 1 |
| 0.860323886639676 | 1 |
| 0.860998650472335 | 1 |
| 0.861673414304993 | 1 |
| 0.862348178137652 | 1 |
| 0.86302294197031 | 1 |
| 0.863697705802969 | 1 |
| 0.864372469635627 | 1 |
| 0.865047233468286 | 1 |
| 0.865721997300945 | 1 |
| 0.866396761133603 | 1 |
| 0.867071524966262 | 1 |
| 0.86774628879892 | 1 |
| 0.868421052631579 | 1 |
| 0.869095816464237 | 1 |
| 0.869770580296896 | 1 |
| 0.870445344129555 | 1 |
| 0.871120107962213 | 1 |
| 0.871794871794872 | 1 |
| 0.87246963562753 | 1 |
| 0.873144399460189 | 1 |
| 0.873819163292847 | 1 |
| 0.874493927125506 | 1 |
| 0.875168690958165 | 1 |
| 0.875843454790823 | 1 |
| 0.876518218623482 | 1 |
| 0.87719298245614 | 1 |
| 0.877867746288799 | 1 |
| 0.878542510121457 | 1 |
| 0.879217273954116 | 1 |
| 0.879892037786775 | 1 |
| 0.880566801619433 | 1 |
| 0.881241565452092 | 1 |
| 0.88191632928475 | 1 |
| 0.882591093117409 | 1 |
| 0.883265856950067 | 1 |
| 0.883940620782726 | 1 |
| 0.884615384615385 | 1 |
| 0.885290148448043 | 1 |
| 0.885964912280702 | 1 |
| 0.88663967611336 | 1 |
| 0.887314439946019 | 1 |
| 0.887989203778677 | 1 |
| 0.888663967611336 | 1 |
| 0.889338731443995 | 1 |
| 0.890013495276653 | 1 |
| 0.890688259109312 | 1 |
| 0.89136302294197 | 1 |
| 0.892037786774629 | 1 |
| 0.892712550607287 | 1 |
| 0.893387314439946 | 1 |
| 0.894062078272605 | 1 |
| 0.894736842105263 | 1 |
| 0.895411605937922 | 1 |
| 0.89608636977058 | 1 |
| 0.896761133603239 | 1 |
| 0.897435897435897 | 1 |
| 0.898110661268556 | 1 |
| 0.898785425101215 | 1 |
| 0.899460188933873 | 1 |
| 0.900134952766532 | 1 |
| 0.90080971659919 | 1 |
| 0.901484480431849 | 1 |
| 0.902159244264507 | 1 |
| 0.902834008097166 | 1 |
| 0.903508771929825 | 1 |
| 0.904183535762483 | 1 |
| 0.904858299595142 | 1 |
| 0.9055330634278 | 1 |
| 0.906207827260459 | 1 |
| 0.906882591093117 | 1 |
| 0.907557354925776 | 1 |
| 0.908232118758435 | 1 |
| 0.908906882591093 | 1 |
| 0.909581646423752 | 1 |
| 0.91025641025641 | 1 |
| 0.910931174089069 | 1 |
| 0.911605937921727 | 1 |
| 0.912280701754386 | 1 |
| 0.912955465587045 | 1 |
| 0.913630229419703 | 1 |
| 0.914304993252362 | 1 |
| 0.91497975708502 | 1 |
| 0.915654520917679 | 1 |
| 0.916329284750337 | 1 |
| 0.917004048582996 | 1 |
| 0.917678812415655 | 1 |
| 0.918353576248313 | 1 |
| 0.919028340080972 | 1 |
| 0.91970310391363 | 1 |
| 0.920377867746289 | 1 |
| 0.921052631578947 | 1 |
| 0.921727395411606 | 1 |
| 0.922402159244265 | 1 |
| 0.923076923076923 | 1 |
| 0.923751686909582 | 1 |
| 0.92442645074224 | 1 |
| 0.925101214574899 | 1 |
| 0.925775978407557 | 1 |
| 0.926450742240216 | 1 |
| 0.927125506072875 | 1 |
| 0.927800269905533 | 1 |
| 0.928475033738192 | 1 |
| 0.92914979757085 | 1 |
| 0.929824561403509 | 1 |
| 0.930499325236167 | 1 |
| 0.931174089068826 | 1 |
| 0.931848852901485 | 1 |
| 0.932523616734143 | 1 |
| 0.933198380566802 | 1 |
| 0.93387314439946 | 1 |
| 0.934547908232119 | 1 |
| 0.935222672064777 | 1 |
| 0.935897435897436 | 1 |
| 0.936572199730094 | 1 |
| 0.937246963562753 | 1 |
| 0.937921727395412 | 1 |
| 0.93859649122807 | 1 |
| 0.939271255060729 | 1 |
| 0.939946018893387 | 1 |
| 0.940620782726046 | 1 |
| 0.941295546558704 | 1 |
| 0.941970310391363 | 1 |
| 0.942645074224022 | 1 |
| 0.94331983805668 | 1 |
| 0.943994601889339 | 1 |
| 0.944669365721997 | 1 |
| 0.945344129554656 | 1 |
| 0.946018893387314 | 1 |
| 0.946693657219973 | 1 |
| 0.947368421052632 | 1 |
| 0.94804318488529 | 1 |
| 0.948717948717949 | 1 |
| 0.949392712550607 | 1 |
| 0.950067476383266 | 1 |
| 0.950742240215924 | 1 |
| 0.951417004048583 | 1 |
| 0.952091767881242 | 1 |
| 0.9527665317139 | 1 |
| 0.953441295546559 | 1 |
| 0.954116059379217 | 1 |
| 0.954790823211876 | 1 |
| 0.955465587044534 | 1 |
| 0.956140350877193 | 1 |
| 0.956815114709852 | 1 |
| 0.95748987854251 | 1 |
| 0.958164642375169 | 1 |
| 0.958839406207827 | 1 |
| 0.959514170040486 | 1 |
| 0.960188933873144 | 1 |
| 0.960863697705803 | 1 |
| 0.961538461538462 | 1 |
| 0.96221322537112 | 1 |
| 0.962887989203779 | 1 |
| 0.963562753036437 | 1 |
| 0.964237516869096 | 1 |
| 0.964912280701754 | 1 |
| 0.965587044534413 | 1 |
| 0.966261808367072 | 1 |
| 0.96693657219973 | 1 |
| 0.967611336032389 | 1 |
| 0.968286099865047 | 1 |
| 0.968960863697706 | 1 |
| 0.969635627530364 | 1 |
| 0.970310391363023 | 1 |
| 0.970985155195682 | 1 |
| 0.97165991902834 | 1 |
| 0.972334682860999 | 1 |
| 0.973009446693657 | 1 |
| 0.973684210526316 | 1 |
| 0.974358974358974 | 1 |
| 0.975033738191633 | 1 |
| 0.975708502024292 | 1 |
| 0.97638326585695 | 1 |
| 0.977058029689609 | 1 |
| 0.977732793522267 | 1 |
| 0.978407557354926 | 1 |
| 0.979082321187584 | 1 |
| 0.979757085020243 | 1 |
| 0.980431848852902 | 1 |
| 0.98110661268556 | 1 |
| 0.981781376518219 | 1 |
| 0.982456140350877 | 1 |
| 0.983130904183536 | 1 |
| 0.983805668016194 | 1 |
| 0.984480431848853 | 1 |
| 0.985155195681511 | 1 |
| 0.98582995951417 | 1 |
| 0.986504723346829 | 1 |
| 0.987179487179487 | 1 |
| 0.987854251012146 | 1 |
| 0.988529014844804 | 1 |
| 0.989203778677463 | 1 |
| 0.989878542510121 | 1 |
| 0.99055330634278 | 1 |
| 0.991228070175439 | 1 |
| 0.991902834008097 | 1 |
| 0.992577597840756 | 1 |
| 0.993252361673414 | 1 |
| 0.993927125506073 | 1 |
| 0.994601889338731 | 1 |
| 0.99527665317139 | 1 |
| 0.995951417004049 | 1 |
| 0.996626180836707 | 1 |
| 0.997300944669366 | 1 |
| 0.997975708502024 | 1 |
| 0.998650472334683 | 1 |
| 0.999325236167342 | 1 |
| 0.999325691166554 | 1 |